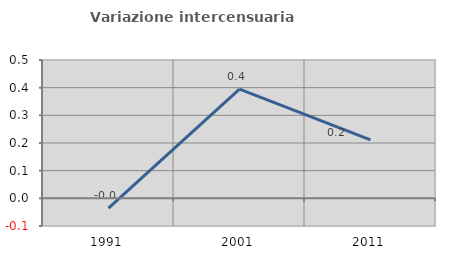
| Category | Variazione intercensuaria annua |
|---|---|
| 1991.0 | -0.035 |
| 2001.0 | 0.394 |
| 2011.0 | 0.211 |